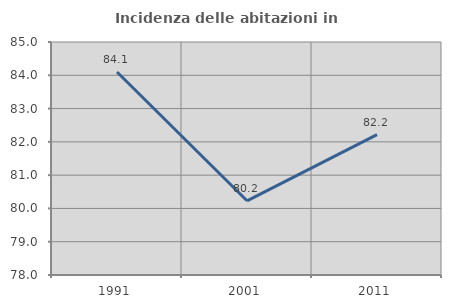
| Category | Incidenza delle abitazioni in proprietà  |
|---|---|
| 1991.0 | 84.098 |
| 2001.0 | 80.229 |
| 2011.0 | 82.216 |